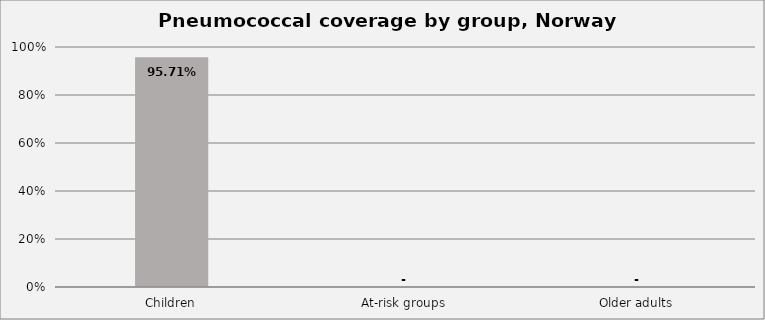
| Category | Series 0 |
|---|---|
| Children | 0.957 |
| At-risk groups | 0 |
| Older adults | 0 |